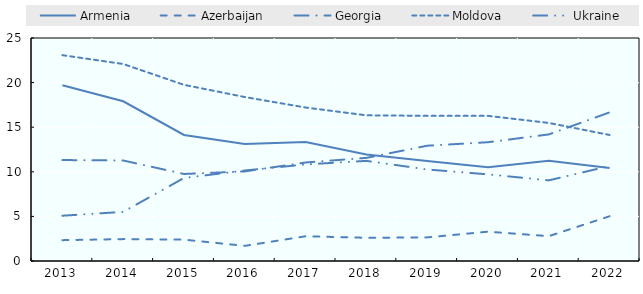
| Category | Armenia | Azerbaijan | Georgia | Moldova | Ukraine |
|---|---|---|---|---|---|
| 2013.0 | 19.711 | 2.337 | 11.316 | 23.077 | 5.075 |
| 2014.0 | 17.904 | 2.454 | 11.269 | 22.085 | 5.508 |
| 2015.0 | 14.133 | 2.393 | 9.755 | 19.748 | 9.309 |
| 2016.0 | 13.107 | 1.698 | 10.044 | 18.381 | 10.146 |
| 2017.0 | 13.348 | 2.773 | 11.045 | 17.206 | 10.823 |
| 2018.0 | 11.943 | 2.602 | 11.56 | 16.332 | 11.226 |
| 2019.0 | 11.219 | 2.647 | 12.926 | 16.274 | 10.26 |
| 2020.0 | 10.497 | 3.286 | 13.316 | 16.273 | 9.713 |
| 2021.0 | 11.231 | 2.785 | 14.192 | 15.478 | 9.041 |
| 2022.0 | 10.433 | 5.018 | 16.663 | 14.128 | 10.65 |